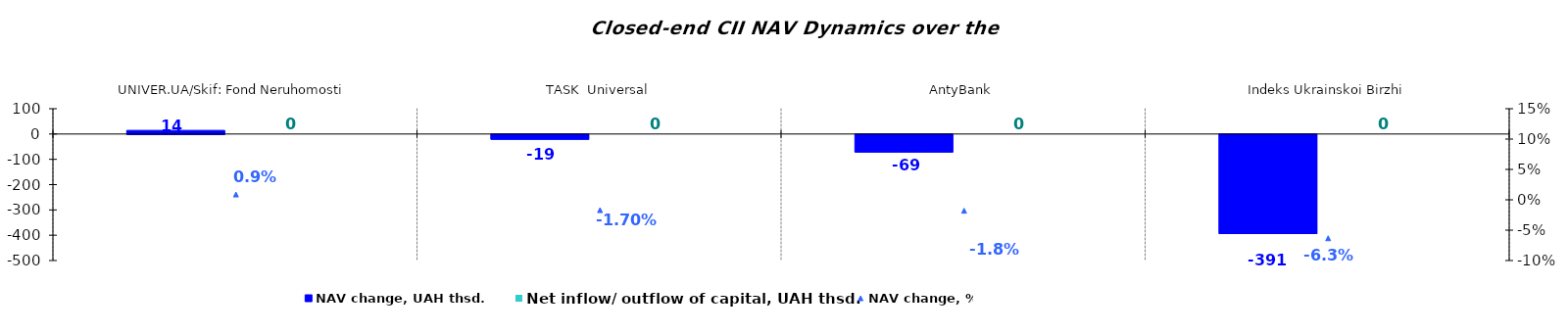
| Category | NAV change, UAH thsd. | Net inflow/ outflow of capital, UAH thsd. |
|---|---|---|
| UNIVER.UA/Skif: Fond Neruhomosti | 14.348 | 0 |
| TASK  Universal | -18.549 | 0 |
| AntyBank | -69.001 | 0 |
| Indeks Ukrainskoi Birzhi | -391.32 | 0 |